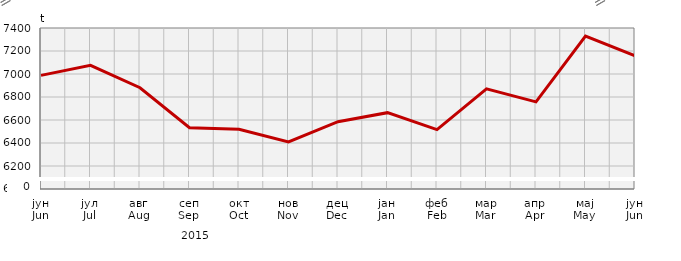
| Category | Прикупљање крављег млијека
Collecting of cow’s milk |
|---|---|
| јун
Jun | 6987.984 |
| јул
Jul | 7075.246 |
| авг
Aug | 6880.441 |
| сеп
Sep | 6532.974 |
| окт
Oct | 6519.778 |
| нов
Nov | 6409.6 |
| дец
Dec | 6585.351 |
| јан
Jan | 6663.893 |
| феб
Feb | 6516.44 |
| мар
Mar | 6870.8 |
| апр
Apr | 6757.289 |
| мај
May | 7329.328 |
| јун
Jun | 7158.306 |